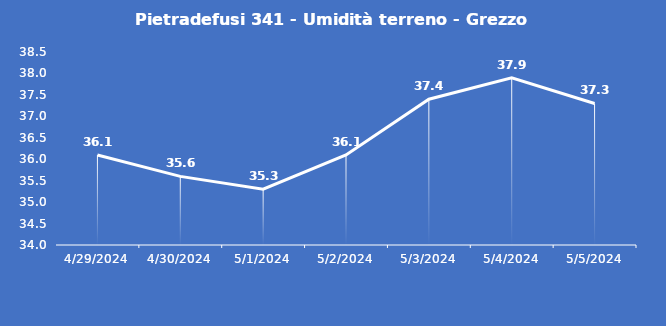
| Category | Pietradefusi 341 - Umidità terreno - Grezzo (%VWC) |
|---|---|
| 4/29/24 | 36.1 |
| 4/30/24 | 35.6 |
| 5/1/24 | 35.3 |
| 5/2/24 | 36.1 |
| 5/3/24 | 37.4 |
| 5/4/24 | 37.9 |
| 5/5/24 | 37.3 |